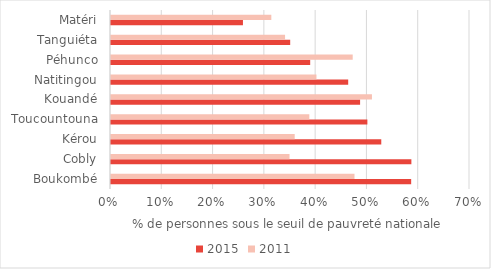
| Category | 2015 | 2011 |
|---|---|---|
| Boukombé | 0.585 | 0.475 |
| Cobly | 0.586 | 0.348 |
| Kérou | 0.527 | 0.358 |
| Toucountouna | 0.5 | 0.387 |
| Kouandé | 0.486 | 0.509 |
| Natitingou | 0.462 | 0.401 |
| Péhunco | 0.388 | 0.471 |
| Tanguiéta | 0.349 | 0.339 |
| Matéri | 0.257 | 0.313 |